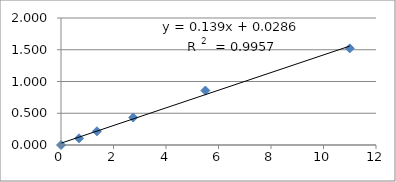
| Category | Series 0 |
|---|---|
| 0.0 | 0 |
| 0.687 | 0.106 |
| 1.37 | 0.216 |
| 2.75 | 0.433 |
| 5.5 | 0.858 |
| 11.0 | 1.522 |